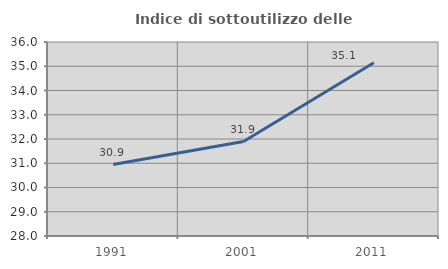
| Category | Indice di sottoutilizzo delle abitazioni  |
|---|---|
| 1991.0 | 30.945 |
| 2001.0 | 31.897 |
| 2011.0 | 35.142 |